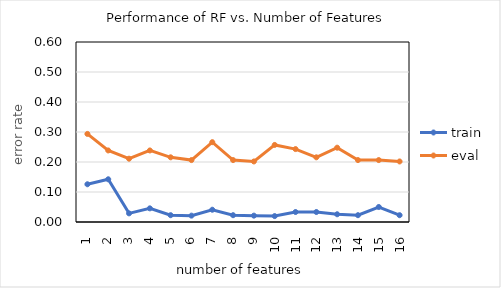
| Category | train | eval |
|---|---|---|
| 1.0 | 0.126 | 0.294 |
| 2.0 | 0.142 | 0.238 |
| 3.0 | 0.029 | 0.211 |
| 4.0 | 0.046 | 0.238 |
| 5.0 | 0.023 | 0.216 |
| 6.0 | 0.021 | 0.206 |
| 7.0 | 0.041 | 0.266 |
| 8.0 | 0.023 | 0.206 |
| 9.0 | 0.021 | 0.202 |
| 10.0 | 0.02 | 0.257 |
| 11.0 | 0.033 | 0.243 |
| 12.0 | 0.033 | 0.216 |
| 13.0 | 0.026 | 0.248 |
| 14.0 | 0.023 | 0.206 |
| 15.0 | 0.05 | 0.206 |
| 16.0 | 0.023 | 0.202 |